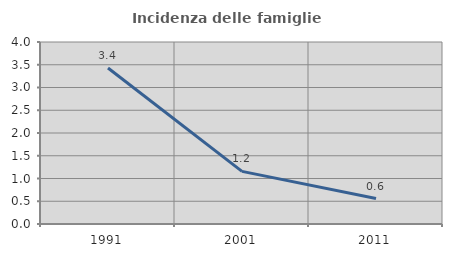
| Category | Incidenza delle famiglie numerose |
|---|---|
| 1991.0 | 3.427 |
| 2001.0 | 1.156 |
| 2011.0 | 0.56 |